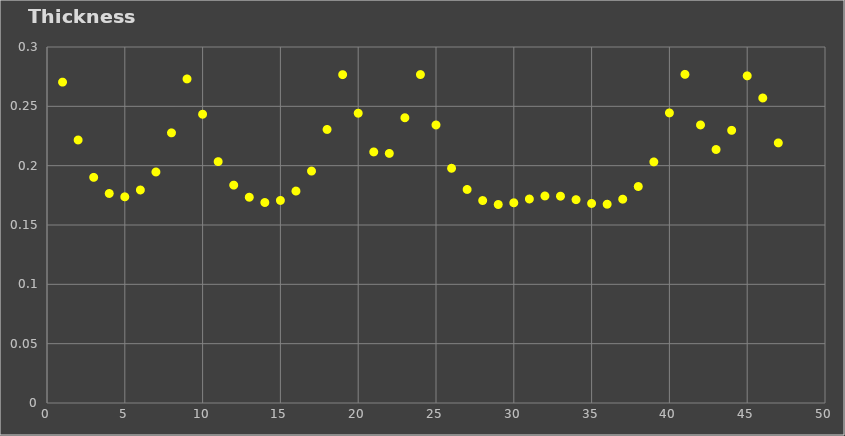
| Category | Thickness (um) |
|---|---|
| 1.0 | 0.27 |
| 2.0 | 0.222 |
| 3.0 | 0.19 |
| 4.0 | 0.177 |
| 5.0 | 0.174 |
| 6.0 | 0.18 |
| 7.0 | 0.195 |
| 8.0 | 0.228 |
| 9.0 | 0.273 |
| 10.0 | 0.243 |
| 11.0 | 0.203 |
| 12.0 | 0.184 |
| 13.0 | 0.173 |
| 14.0 | 0.169 |
| 15.0 | 0.171 |
| 16.0 | 0.179 |
| 17.0 | 0.195 |
| 18.0 | 0.231 |
| 19.0 | 0.277 |
| 20.0 | 0.244 |
| 21.0 | 0.212 |
| 22.0 | 0.21 |
| 23.0 | 0.24 |
| 24.0 | 0.277 |
| 25.0 | 0.234 |
| 26.0 | 0.198 |
| 27.0 | 0.18 |
| 28.0 | 0.171 |
| 29.0 | 0.167 |
| 30.0 | 0.169 |
| 31.0 | 0.172 |
| 32.0 | 0.174 |
| 33.0 | 0.174 |
| 34.0 | 0.171 |
| 35.0 | 0.168 |
| 36.0 | 0.168 |
| 37.0 | 0.172 |
| 38.0 | 0.182 |
| 39.0 | 0.203 |
| 40.0 | 0.244 |
| 41.0 | 0.277 |
| 42.0 | 0.234 |
| 43.0 | 0.214 |
| 44.0 | 0.23 |
| 45.0 | 0.276 |
| 46.0 | 0.257 |
| 47.0 | 0.219 |